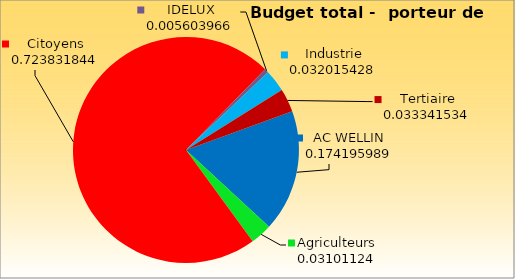
| Category | % |
|---|---|
| AC WELLIN | 0.174 |
| Agriculteurs | 0.031 |
| Citoyens | 0.724 |
| IDELUX | 0.006 |
| Industrie | 0.032 |
| Tertiaire | 0.033 |